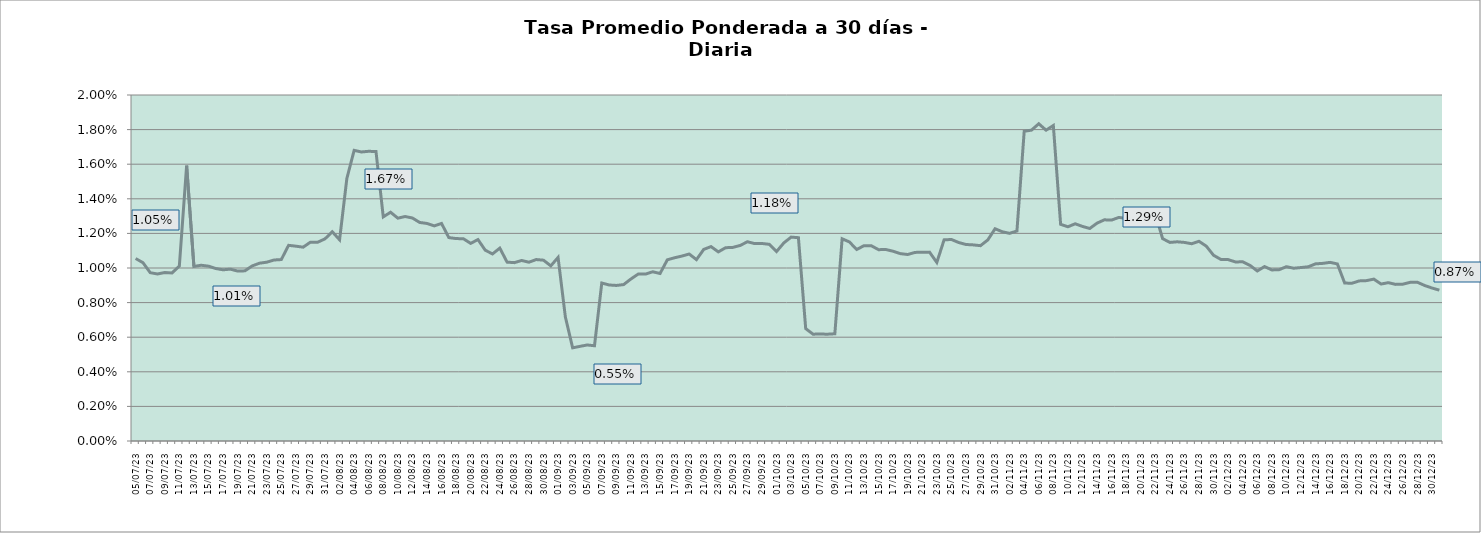
| Category | Tasa a 30 días |
|---|---|
| 2023-07-05 | 0.011 |
| 2023-07-06 | 0.01 |
| 2023-07-07 | 0.01 |
| 2023-07-08 | 0.01 |
| 2023-07-09 | 0.01 |
| 2023-07-10 | 0.01 |
| 2023-07-11 | 0.01 |
| 2023-07-12 | 0.016 |
| 2023-07-13 | 0.01 |
| 2023-07-14 | 0.01 |
| 2023-07-15 | 0.01 |
| 2023-07-16 | 0.01 |
| 2023-07-17 | 0.01 |
| 2023-07-18 | 0.01 |
| 2023-07-19 | 0.01 |
| 2023-07-20 | 0.01 |
| 2023-07-21 | 0.01 |
| 2023-07-22 | 0.01 |
| 2023-07-23 | 0.01 |
| 2023-07-24 | 0.01 |
| 2023-07-25 | 0.01 |
| 2023-07-26 | 0.011 |
| 2023-07-27 | 0.011 |
| 2023-07-28 | 0.011 |
| 2023-07-29 | 0.011 |
| 2023-07-30 | 0.011 |
| 2023-07-31 | 0.012 |
| 2023-08-01 | 0.012 |
| 2023-08-02 | 0.012 |
| 2023-08-03 | 0.015 |
| 2023-08-04 | 0.017 |
| 2023-08-05 | 0.017 |
| 2023-08-06 | 0.017 |
| 2023-08-07 | 0.017 |
| 2023-08-08 | 0.013 |
| 2023-08-09 | 0.013 |
| 2023-08-10 | 0.013 |
| 2023-08-11 | 0.013 |
| 2023-08-12 | 0.013 |
| 2023-08-13 | 0.013 |
| 2023-08-14 | 0.013 |
| 2023-08-15 | 0.012 |
| 2023-08-16 | 0.013 |
| 2023-08-17 | 0.012 |
| 2023-08-18 | 0.012 |
| 2023-08-19 | 0.012 |
| 2023-08-20 | 0.011 |
| 2023-08-21 | 0.012 |
| 2023-08-22 | 0.011 |
| 2023-08-23 | 0.011 |
| 2023-08-24 | 0.011 |
| 2023-08-25 | 0.01 |
| 2023-08-26 | 0.01 |
| 2023-08-27 | 0.01 |
| 2023-08-28 | 0.01 |
| 2023-08-29 | 0.01 |
| 2023-08-30 | 0.01 |
| 2023-08-31 | 0.01 |
| 2023-09-01 | 0.011 |
| 2023-09-02 | 0.007 |
| 2023-09-03 | 0.005 |
| 2023-09-04 | 0.005 |
| 2023-09-05 | 0.006 |
| 2023-09-06 | 0.006 |
| 2023-09-07 | 0.009 |
| 2023-09-08 | 0.009 |
| 2023-09-09 | 0.009 |
| 2023-09-10 | 0.009 |
| 2023-09-11 | 0.009 |
| 2023-09-12 | 0.01 |
| 2023-09-13 | 0.01 |
| 2023-09-14 | 0.01 |
| 2023-09-15 | 0.01 |
| 2023-09-16 | 0.01 |
| 2023-09-17 | 0.011 |
| 2023-09-18 | 0.011 |
| 2023-09-19 | 0.011 |
| 2023-09-20 | 0.01 |
| 2023-09-21 | 0.011 |
| 2023-09-22 | 0.011 |
| 2023-09-23 | 0.011 |
| 2023-09-24 | 0.011 |
| 2023-09-25 | 0.011 |
| 2023-09-26 | 0.011 |
| 2023-09-27 | 0.012 |
| 2023-09-28 | 0.011 |
| 2023-09-29 | 0.011 |
| 2023-09-30 | 0.011 |
| 2023-10-01 | 0.011 |
| 2023-10-02 | 0.011 |
| 2023-10-03 | 0.012 |
| 2023-10-04 | 0.012 |
| 2023-10-05 | 0.006 |
| 2023-10-06 | 0.006 |
| 2023-10-07 | 0.006 |
| 2023-10-08 | 0.006 |
| 2023-10-09 | 0.006 |
| 2023-10-10 | 0.012 |
| 2023-10-11 | 0.012 |
| 2023-10-12 | 0.011 |
| 2023-10-13 | 0.011 |
| 2023-10-14 | 0.011 |
| 2023-10-15 | 0.011 |
| 2023-10-16 | 0.011 |
| 2023-10-17 | 0.011 |
| 2023-10-18 | 0.011 |
| 2023-10-19 | 0.011 |
| 2023-10-20 | 0.011 |
| 2023-10-21 | 0.011 |
| 2023-10-22 | 0.011 |
| 2023-10-23 | 0.01 |
| 2023-10-24 | 0.012 |
| 2023-10-25 | 0.012 |
| 2023-10-26 | 0.011 |
| 2023-10-27 | 0.011 |
| 2023-10-28 | 0.011 |
| 2023-10-29 | 0.011 |
| 2023-10-30 | 0.012 |
| 2023-10-31 | 0.012 |
| 2023-11-01 | 0.012 |
| 2023-11-02 | 0.012 |
| 2023-11-03 | 0.012 |
| 2023-11-04 | 0.018 |
| 2023-11-05 | 0.018 |
| 2023-11-06 | 0.018 |
| 2023-11-07 | 0.018 |
| 2023-11-08 | 0.018 |
| 2023-11-09 | 0.013 |
| 2023-11-10 | 0.012 |
| 2023-11-11 | 0.013 |
| 2023-11-12 | 0.012 |
| 2023-11-13 | 0.012 |
| 2023-11-14 | 0.013 |
| 2023-11-15 | 0.013 |
| 2023-11-16 | 0.013 |
| 2023-11-17 | 0.013 |
| 2023-11-18 | 0.013 |
| 2023-11-19 | 0.013 |
| 2023-11-20 | 0.013 |
| 2023-11-21 | 0.012 |
| 2023-11-22 | 0.013 |
| 2023-11-23 | 0.012 |
| 2023-11-24 | 0.011 |
| 2023-11-25 | 0.012 |
| 2023-11-26 | 0.011 |
| 2023-11-27 | 0.011 |
| 2023-11-28 | 0.012 |
| 2023-11-29 | 0.011 |
| 2023-11-30 | 0.011 |
| 2023-12-01 | 0.01 |
| 2023-12-02 | 0.01 |
| 2023-12-03 | 0.01 |
| 2023-12-04 | 0.01 |
| 2023-12-05 | 0.01 |
| 2023-12-06 | 0.01 |
| 2023-12-07 | 0.01 |
| 2023-12-08 | 0.01 |
| 2023-12-09 | 0.01 |
| 2023-12-10 | 0.01 |
| 2023-12-11 | 0.01 |
| 2023-12-12 | 0.01 |
| 2023-12-13 | 0.01 |
| 2023-12-14 | 0.01 |
| 2023-12-15 | 0.01 |
| 2023-12-16 | 0.01 |
| 2023-12-17 | 0.01 |
| 2023-12-18 | 0.009 |
| 2023-12-19 | 0.009 |
| 2023-12-20 | 0.009 |
| 2023-12-21 | 0.009 |
| 2023-12-22 | 0.009 |
| 2023-12-23 | 0.009 |
| 2023-12-24 | 0.009 |
| 2023-12-25 | 0.009 |
| 2023-12-26 | 0.009 |
| 2023-12-27 | 0.009 |
| 2023-12-28 | 0.009 |
| 2023-12-29 | 0.009 |
| 2023-12-30 | 0.009 |
| 2023-12-31 | 0.009 |